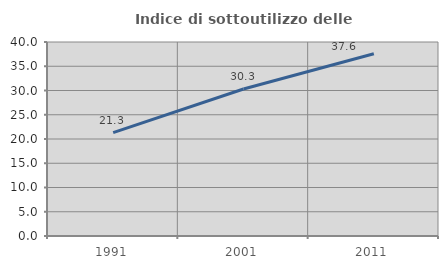
| Category | Indice di sottoutilizzo delle abitazioni  |
|---|---|
| 1991.0 | 21.308 |
| 2001.0 | 30.318 |
| 2011.0 | 37.565 |